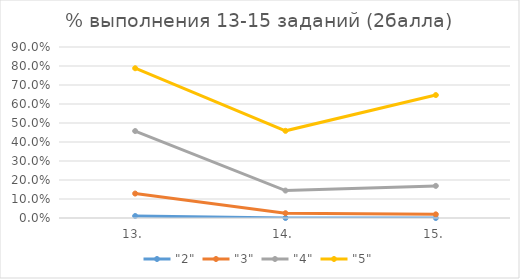
| Category | "2" | "3" | "4" | "5" |
|---|---|---|---|---|
| 13. | 0.011 | 0.129 | 0.458 | 0.788 |
| 14. | 0 | 0.025 | 0.144 | 0.459 |
| 15. | 0 | 0.019 | 0.169 | 0.647 |